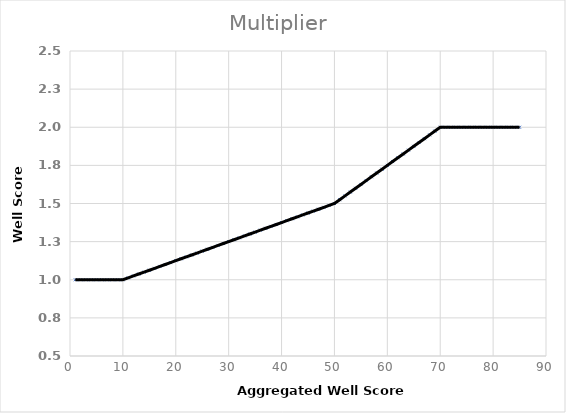
| Category | Multiplier |
|---|---|
| 1.0 | 1 |
| 2.0 | 1 |
| 3.0 | 1 |
| 4.0 | 1 |
| 5.0 | 1 |
| 6.0 | 1 |
| 7.0 | 1 |
| 8.0 | 1 |
| 9.0 | 1 |
| 10.0 | 1 |
| 11.0 | 1.012 |
| 12.0 | 1.025 |
| 13.0 | 1.038 |
| 14.0 | 1.05 |
| 15.0 | 1.062 |
| 16.0 | 1.075 |
| 17.0 | 1.088 |
| 18.0 | 1.1 |
| 19.0 | 1.112 |
| 20.0 | 1.125 |
| 21.0 | 1.138 |
| 22.0 | 1.15 |
| 23.0 | 1.162 |
| 24.0 | 1.175 |
| 25.0 | 1.188 |
| 26.0 | 1.2 |
| 27.0 | 1.212 |
| 28.0 | 1.225 |
| 29.0 | 1.238 |
| 30.0 | 1.25 |
| 31.0 | 1.262 |
| 32.0 | 1.275 |
| 33.0 | 1.288 |
| 34.0 | 1.3 |
| 35.0 | 1.312 |
| 36.0 | 1.325 |
| 37.0 | 1.338 |
| 38.0 | 1.35 |
| 39.0 | 1.362 |
| 40.0 | 1.375 |
| 41.0 | 1.388 |
| 42.0 | 1.4 |
| 43.0 | 1.412 |
| 44.0 | 1.425 |
| 45.0 | 1.438 |
| 46.0 | 1.45 |
| 47.0 | 1.462 |
| 48.0 | 1.475 |
| 49.0 | 1.488 |
| 50.0 | 1.5 |
| 51.0 | 1.525 |
| 52.0 | 1.55 |
| 53.0 | 1.575 |
| 54.0 | 1.6 |
| 55.0 | 1.625 |
| 56.0 | 1.65 |
| 57.0 | 1.675 |
| 58.0 | 1.7 |
| 59.0 | 1.725 |
| 60.0 | 1.75 |
| 61.0 | 1.775 |
| 62.0 | 1.8 |
| 63.0 | 1.825 |
| 64.0 | 1.85 |
| 65.0 | 1.875 |
| 66.0 | 1.9 |
| 67.0 | 1.925 |
| 68.0 | 1.95 |
| 69.0 | 1.975 |
| 70.0 | 2 |
| 71.0 | 2 |
| 72.0 | 2 |
| 73.0 | 2 |
| 74.0 | 2 |
| 75.0 | 2 |
| 76.0 | 2 |
| 77.0 | 2 |
| 78.0 | 2 |
| 79.0 | 2 |
| 80.0 | 2 |
| 81.0 | 2 |
| 82.0 | 2 |
| 83.0 | 2 |
| 84.0 | 2 |
| 85.0 | 2 |